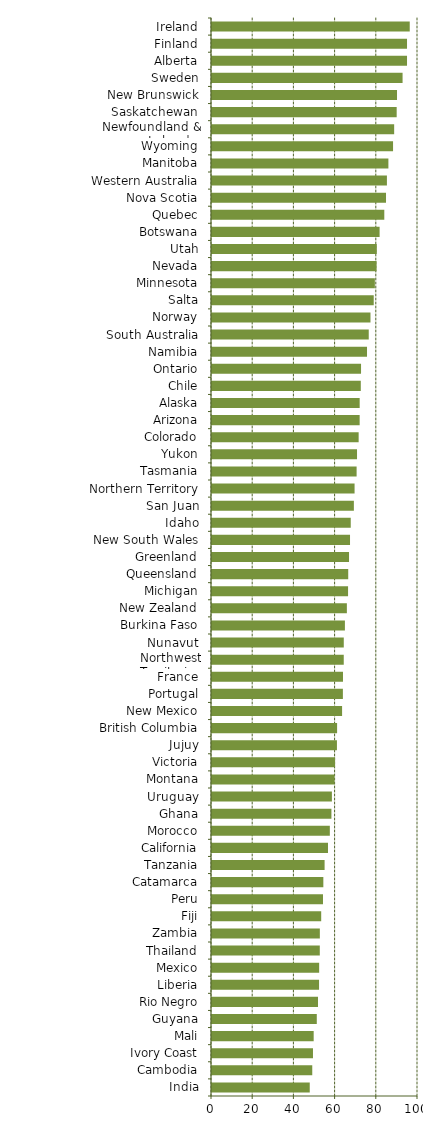
| Category | Series 0 |
|---|---|
| India | 47.45 |
| Cambodia | 48.67 |
| Ivory Coast | 49.02 |
| Mali | 49.36 |
| Guyana | 50.87 |
| Rio Negro | 51.46 |
| Liberia | 51.97 |
| Mexico | 52.02 |
| Thailand | 52.33 |
| Zambia | 52.35 |
| Fiji | 53.01 |
| Peru | 53.88 |
| Catamarca | 54.05 |
| Tanzania | 54.66 |
| California | 56.31 |
| Morocco | 57.2 |
| Ghana | 57.97 |
| Uruguay | 58.2 |
| Montana | 59.47 |
| Victoria | 59.74 |
| Jujuy | 60.65 |
| British Columbia | 60.73 |
| New Mexico | 63.15 |
| Portugal | 63.54 |
| France | 63.59 |
| Northwest Territories | 63.96 |
| Nunavut | 63.97 |
| Burkina Faso | 64.52 |
| New Zealand | 65.47 |
| Michigan | 66.05 |
| Queensland | 66.13 |
| Greenland | 66.52 |
| New South Wales | 67 |
| Idaho | 67.35 |
| San Juan | 68.87 |
| Northern Territory | 69.21 |
| Tasmania | 70.2 |
| Yukon | 70.4 |
| Colorado | 71.19 |
| Arizona | 71.68 |
| Alaska | 71.69 |
| Chile | 72.23 |
| Ontario | 72.35 |
| Namibia | 75.25 |
| South Australia | 76.09 |
| Norway | 76.93 |
| Salta | 78.51 |
| Minnesota | 79.06 |
| Nevada | 79.89 |
| Utah | 80 |
| Botswana | 81.36 |
| Quebec | 83.64 |
| Nova Scotia | 84.47 |
| Western Australia | 84.91 |
| Manitoba | 85.63 |
| Wyoming | 87.89 |
| Newfoundland & Labrador | 88.43 |
| Saskatchewan | 89.65 |
| New Brunswick | 89.81 |
| Sweden | 92.51 |
| Alberta | 94.67 |
| Finland | 94.67 |
| Ireland | 95.99 |